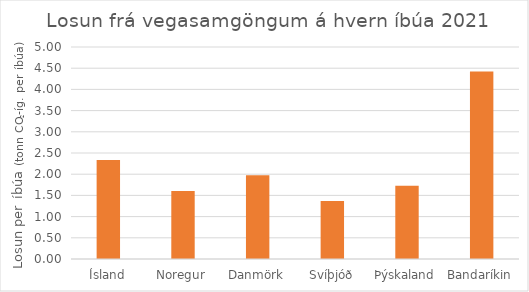
| Category | Losun frá vegasamgöngum á hvern íbúa 2021 (tonn CO2-íg. per íbúa) |
|---|---|
| Ísland | 2.334 |
| Noregur | 1.605 |
| Danmörk | 1.976 |
| Svíþjóð | 1.366 |
| Þýskaland | 1.728 |
| Bandaríkin | 4.42 |